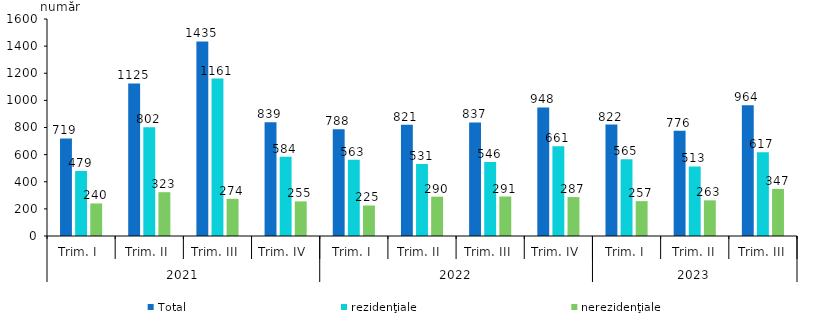
| Category | Total | rezidenţiale | nerezidenţiale |
|---|---|---|---|
| 0 | 719 | 479 | 240 |
| 1 | 1125 | 802 | 323 |
| 2 | 1435 | 1161 | 274 |
| 3 | 839 | 584 | 255 |
| 4 | 788 | 563 | 225 |
| 5 | 821 | 531 | 290 |
| 6 | 837 | 546 | 291 |
| 7 | 948 | 661 | 287 |
| 8 | 822 | 565 | 257 |
| 9 | 776 | 513 | 263 |
| 10 | 964 | 617 | 347 |